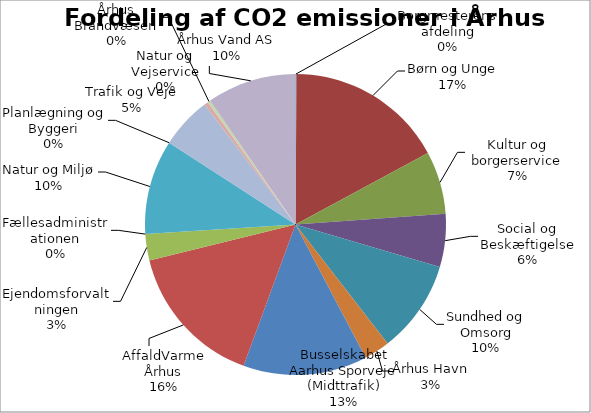
| Category | Series 0 | Series 1 |
|---|---|---|
| Borgmesterens afdeling |  | 149.789 |
| Børn og Unge |  | 24110.836 |
| Kultur og Borgerservice |  | 9565.206 |
| Social og Beskæftigelse |  | 8092.383 |
| Sundhed og Omsorg |  | 14115.304 |
| Århus Havn |  | 3912.356 |
| Busselskabet Aarhus Sporveje (Midttrafik) |  | 18885.52 |
| AffaldVarme Århus |  | 22025.507 |
| Ejendomsforvaltningen |  | 4023.912 |
| Fællesadministrationen |  | 0 |
| Natur og Miljø |  | -14402.781 |
| Planlægning og Byggeri |  | 2.921 |
| Trafik og Veje |  | 7839.383 |
| Natur og Vejservice |  | 595.766 |
| Århus Brandvæsen |  | 417.437 |
| Århus Vand AS |  | 13626.296 |